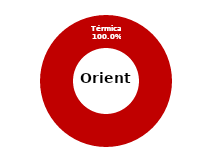
| Category | Oriente |
|---|---|
| Eólica | 0 |
| Hidráulica | 0 |
| Solar | 0 |
| Térmica | 35.386 |